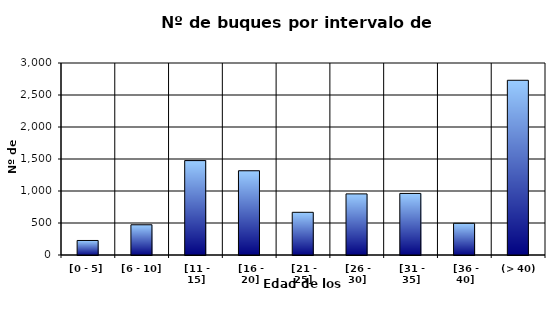
| Category | [0 - 5] |
|---|---|
| [0 - 5] | 227 |
|  [6 - 10] | 472 |
|  [11 - 15] | 1475 |
|  [16 - 20] | 1316 |
|  [21 - 25] | 667 |
|  [26 - 30] | 955 |
|  [31 - 35] | 962 |
|  [36 - 40] | 495 |
|  (> 40) | 2730 |